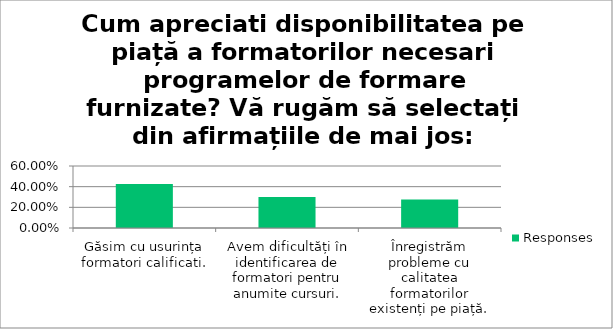
| Category | Responses |
|---|---|
| Găsim cu usurința formatori calificati. | 0.425 |
| Avem dificultăți în identificarea de formatori pentru anumite cursuri. | 0.3 |
| Înregistrăm probleme cu calitatea formatorilor existenți pe piață. | 0.275 |